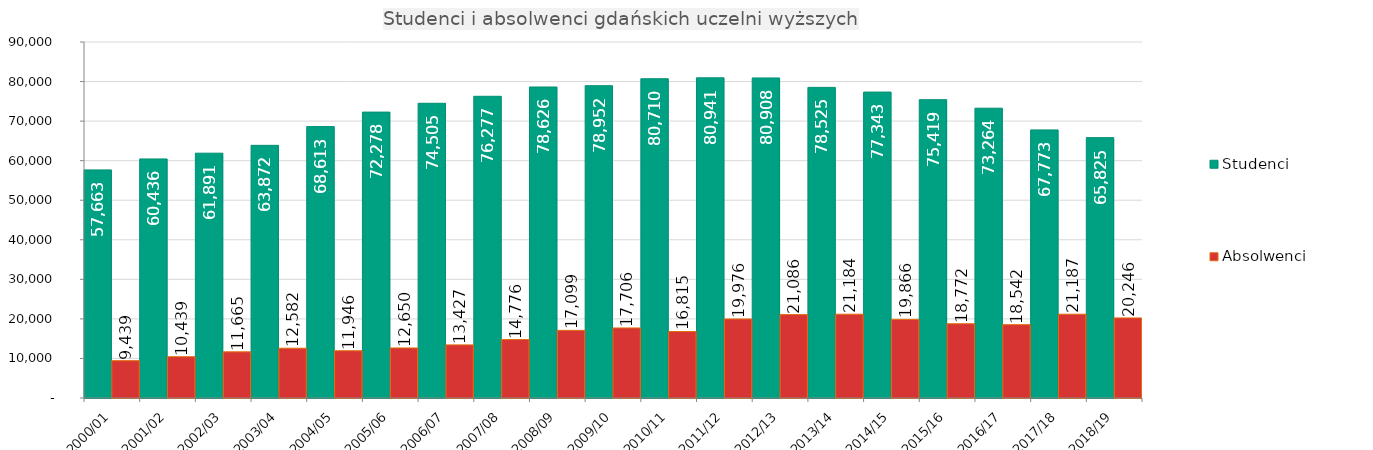
| Category | Studenci | Absolwenci |
|---|---|---|
| 2000/01 | 57663 | 9439 |
| 2001/02 | 60436 | 10439 |
| 2002/03 | 61891 | 11665 |
| 2003/04 | 63872 | 12582 |
| 2004/05 | 68613 | 11946 |
| 2005/06 | 72278 | 12650 |
| 2006/07 | 74505 | 13427 |
| 2007/08 | 76277 | 14776 |
| 2008/09 | 78626 | 17099 |
| 2009/10 | 78952 | 17706 |
| 2010/11 | 80710 | 16815 |
| 2011/12 | 80941 | 19976 |
| 2012/13 | 80908 | 21086 |
| 2013/14 | 78525 | 21184 |
| 2014/15 | 77343 | 19866 |
| 2015/16 | 75419 | 18772 |
| 2016/17 | 73264 | 18542 |
| 2017/18 | 67773 | 21187 |
| 2018/19 | 65825 | 20246 |